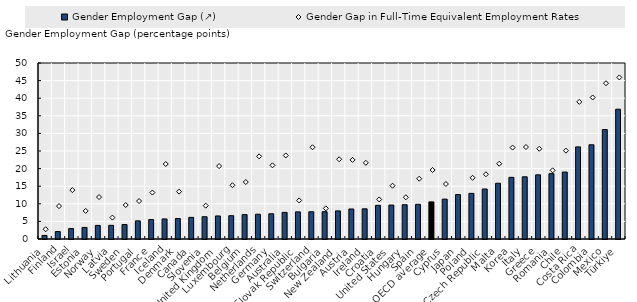
| Category | Gender Employment Gap (↗) |
|---|---|
| Lithuania | 1.018 |
| Finland | 2.11 |
| Israel | 2.968 |
| Estonia | 3.283 |
| Norway | 3.86 |
| Latvia | 3.882 |
| Sweden | 4.107 |
| Portugal | 5.15 |
| France | 5.522 |
| Iceland | 5.701 |
| Denmark | 5.828 |
| Canada | 6.147 |
| Slovenia | 6.328 |
| United Kingdom | 6.549 |
| Luxembourg | 6.621 |
| Belgium | 6.937 |
| Netherlands | 7.032 |
| Germany | 7.16 |
| Australia | 7.561 |
| Slovak Republic | 7.71 |
| Switzerland | 7.739 |
| Bulgaria | 7.761 |
| New Zealand | 7.982 |
| Austria | 8.527 |
| Ireland | 8.576 |
| Croatia | 9.566 |
| United States | 9.645 |
| Hungary | 9.741 |
| Spain | 9.858 |
| OECD average | 10.544 |
| Cyprus | 11.324 |
| Japan | 12.619 |
| Poland | 12.963 |
| Czech Republic | 14.205 |
| Malta | 15.835 |
| Korea | 17.517 |
| Italy | 17.672 |
| Greece | 18.23 |
| Romania | 18.568 |
| Chile | 19.017 |
| Costa Rica | 26.166 |
| Colombia | 26.762 |
| Mexico | 31.089 |
| Türkiye | 36.873 |